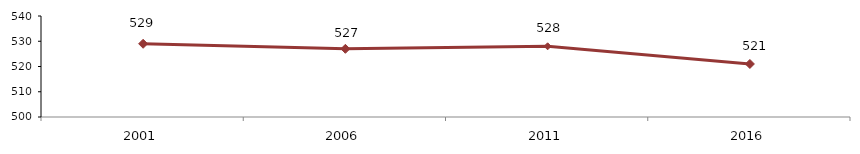
| Category | Prélever et Inférer |
|---|---|
| 2001.0 | 529 |
| 2006.0 | 527 |
| 2011.0 | 528 |
| 2016.0 | 521 |